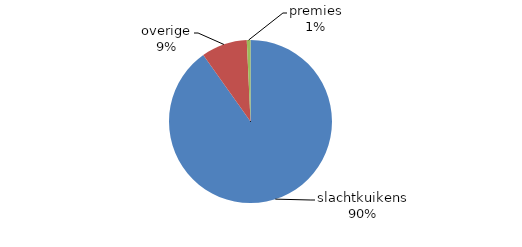
| Category | Series 4 |
|---|---|
| slachtkuikens | 946806.448 |
| overige | 95734.542 |
| premies | 7656.742 |